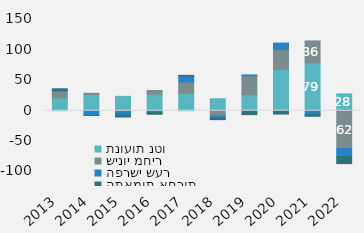
| Category | תנועות נטו | שינוי מחיר | הפרשי שער | התאמות אחרות |
|---|---|---|---|---|
| 2013 | 21137.009 | 10900.181 | 1685.825 | 2336.001 |
| 2014 | 26594.748 | 2072.293 | -7481.04 | -311.352 |
| 2015 | 23658.662 | -862.354 | -5824.621 | -3710.768 |
| 2016 | 27428.199 | 5826.825 | -2542.125 | -3367.127 |
| 2017 | 28375.494 | 18978.13 | 9273.007 | 1528.327 |
| 2018 | 19613.365 | -8992.913 | -3856.6 | -1845.906 |
| 2019 | 26270.43 | 31120.391 | 1487.997 | -6467.394 |
| 2020 | 67951.823 | 32638.744 | 10607.72 | -5578.226 |
| 2021 | 78578.371 | 36170.996 | -6393.511 | -2834.686 |
| 2022 | 27627 | -62376 | -12938 | -11652 |